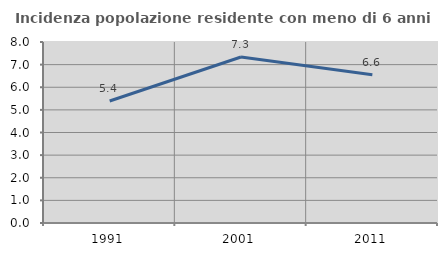
| Category | Incidenza popolazione residente con meno di 6 anni |
|---|---|
| 1991.0 | 5.391 |
| 2001.0 | 7.338 |
| 2011.0 | 6.553 |